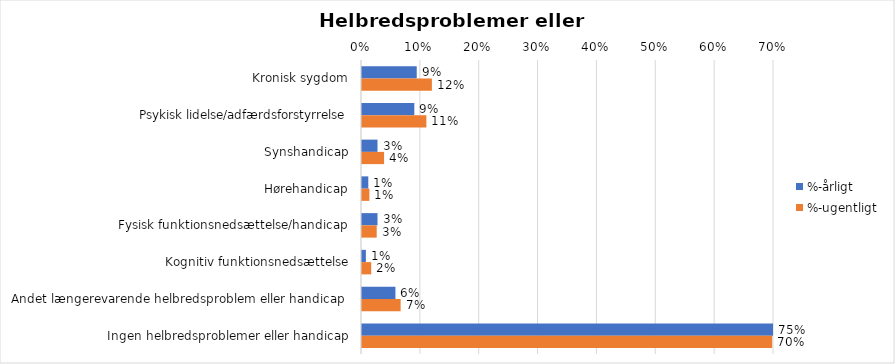
| Category | %-årligt | %-ugentligt |
|---|---|---|
| Kronisk sygdom | 0.093 | 0.119 |
| Psykisk lidelse/adfærdsforstyrrelse | 0.089 | 0.109 |
| Synshandicap | 0.026 | 0.038 |
| Hørehandicap | 0.011 | 0.012 |
| Fysisk funktionsnedsættelse/handicap | 0.026 | 0.025 |
| Kognitiv funktionsnedsættelse | 0.007 | 0.016 |
| Andet længerevarende helbredsproblem eller handicap  | 0.057 | 0.066 |
| Ingen helbredsproblemer eller handicap | 0.747 | 0.697 |